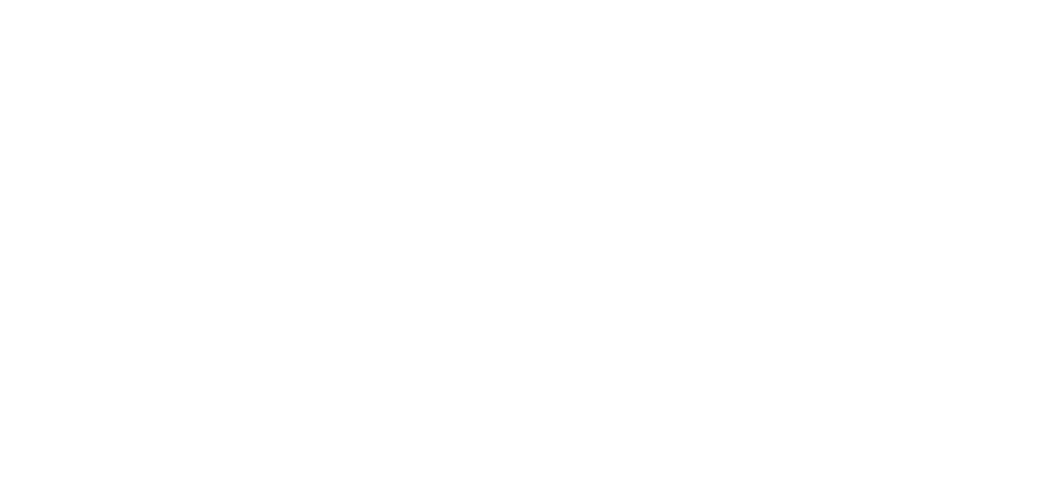
| Category | Total |
|---|---|
| Al Hodeidah | 577 |
| Hajjah | 484 |
| Marib | 213 |
| Taiz | 204 |
| Al Jawf | 171 |
| Amran | 148 |
| Hadramawt | 105 |
| Ad Dali | 97 |
| Lahj | 77 |
| Abyan | 65 |
| Sanaa | 52 |
| Ibb | 49 |
| Sadah | 46 |
| Al Bayda | 37 |
| Aden | 34 |
| Dhamar | 22 |
| Shabwah | 17 |
| Al Maharah | 12 |
| Raymah | 8 |
| Al Mahwit | 8 |
| Sanaa City | 4 |
| Socotra | 1 |